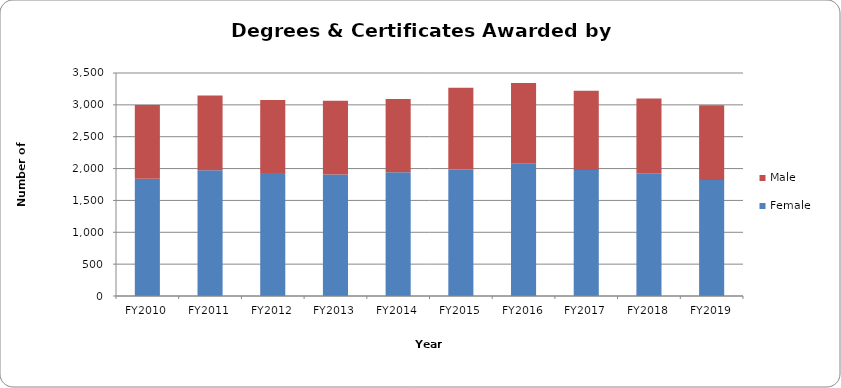
| Category | Female | Male |
|---|---|---|
| FY2010 | 1840 | 1159 |
| FY2011 | 1974 | 1173 |
| FY2012 | 1929 | 1149 |
| FY2013 | 1907 | 1157 |
| FY2014 | 1943 | 1147 |
| FY2015 | 1985 | 1282 |
| FY2016 | 2084 | 1260 |
| FY2017 | 1979 | 1244 |
| FY2018 | 1927 | 1171 |
| FY2019 | 1821 | 1172 |